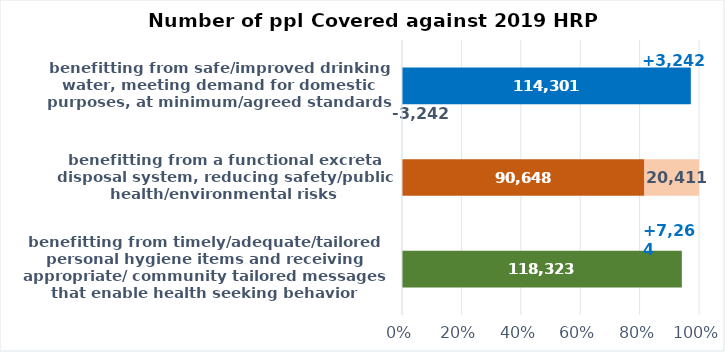
| Category | Coverage | Gap |
|---|---|---|
| benefitting from timely/adequate/tailored personal hygiene items and receiving appropriate/ community tailored messages that enable health seeking behavior | 118323 | -7264 |
| benefitting from a functional excreta disposal system, reducing safety/public health/environmental risks | 90648 | 20411 |
| benefitting from safe/improved drinking water, meeting demand for domestic purposes, at minimum/agreed standards | 114301.493 | -3242.493 |